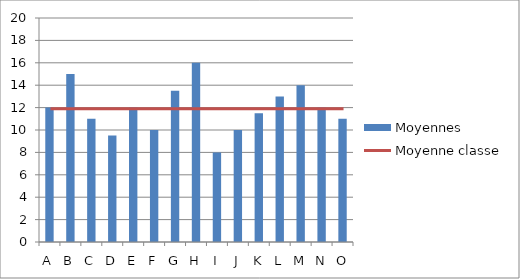
| Category | Moyennes |
|---|---|
| 0 | 12 |
| 1 | 15 |
| 2 | 11 |
| 3 | 9.5 |
| 4 | 12 |
| 5 | 10 |
| 6 | 13.5 |
| 7 | 16 |
| 8 | 8 |
| 9 | 10 |
| 10 | 11.5 |
| 11 | 13 |
| 12 | 14 |
| 13 | 12 |
| 14 | 11 |